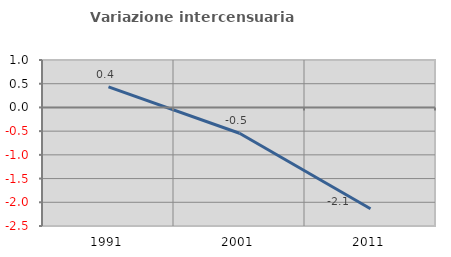
| Category | Variazione intercensuaria annua |
|---|---|
| 1991.0 | 0.433 |
| 2001.0 | -0.544 |
| 2011.0 | -2.137 |